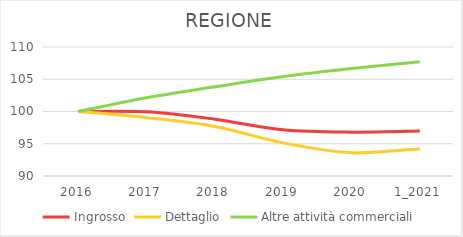
| Category | Ingrosso | Dettaglio | Altre attività commerciali |
|---|---|---|---|
| 2016 | 100 | 100 | 100 |
| 2017 | 99.953 | 99.046 | 102.143 |
| 2018 | 98.805 | 97.685 | 103.824 |
| 2019 | 97.164 | 95.135 | 105.412 |
| 2020 | 96.796 | 93.601 | 106.664 |
| 1_2021 | 96.97 | 94.235 | 107.722 |